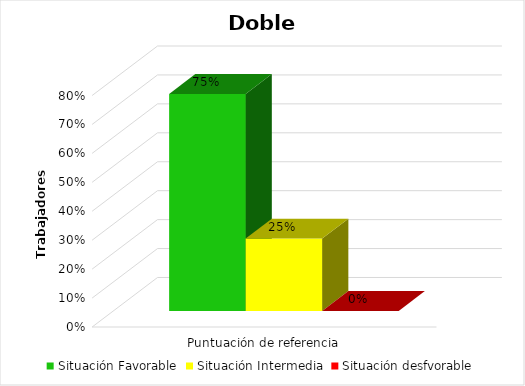
| Category | Situación Favorable | Situación Intermedia | Situación desfvorable |
|---|---|---|---|
| 0 | 0.75 | 0.25 | 0 |